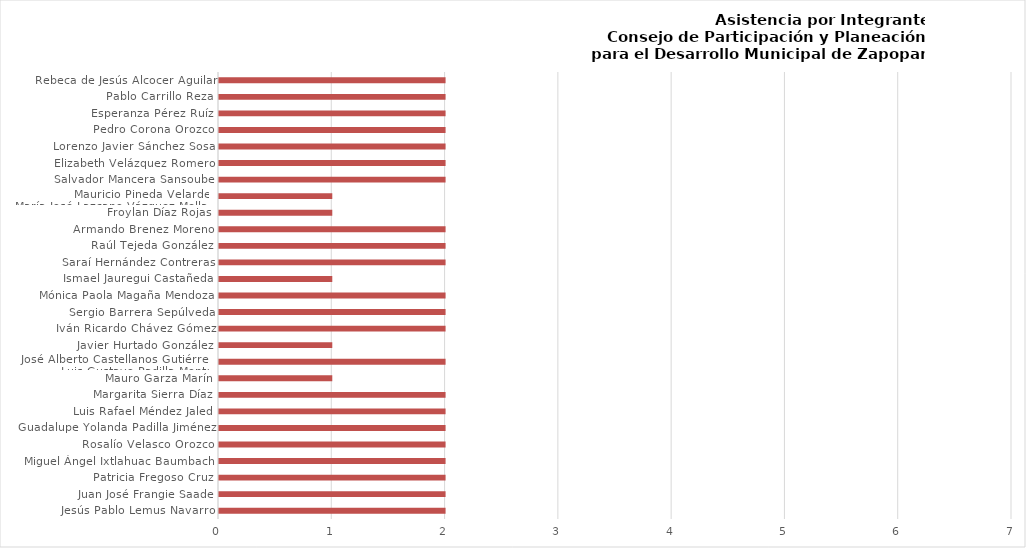
| Category | Series 0 |
|---|---|
| Jesús Pablo Lemus Navarro | 2 |
| Juan José Frangie Saade | 2 |
| Patricia Fregoso Cruz | 2 |
| Miguel Ángel Ixtlahuac Baumbach | 2 |
| Rosalío Velasco Orozco | 2 |
| Guadalupe Yolanda Padilla Jiménez | 2 |
| Luis Rafael Méndez Jaled | 2 |
| Margarita Sierra Díaz | 2 |
| Mauro Garza Marín | 1 |
| José Alberto Castellanos Gutiérrez /
Luis Gustavo Padilla Montes | 2 |
| Javier Hurtado González | 1 |
| Iván Ricardo Chávez Gómez | 2 |
| Sergio Barrera Sepúlveda | 2 |
| Mónica Paola Magaña Mendoza | 2 |
| Ismael Jauregui Castañeda | 1 |
| Saraí Hernández Contreras | 2 |
| Raúl Tejeda González | 2 |
| Armando Brenez Moreno | 2 |
| Froylan Díaz Rojas | 1 |
| Mauricio Pineda Velarde /
María José Lazcano Vázquez Mellado | 1 |
| Salvador Mancera Sansoube | 2 |
| Elizabeth Velázquez Romero | 2 |
| Lorenzo Javier Sánchez Sosa | 2 |
| Pedro Corona Orozco | 2 |
| Esperanza Pérez Ruíz | 2 |
| Pablo Carrillo Reza | 2 |
| Rebeca de Jesús Alcocer Aguilar | 2 |